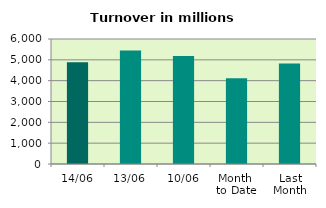
| Category | Series 0 |
|---|---|
| 14/06 | 4882.674 |
| 13/06 | 5446.547 |
| 10/06 | 5182.341 |
| Month 
to Date | 4113.62 |
| Last
Month | 4818.103 |